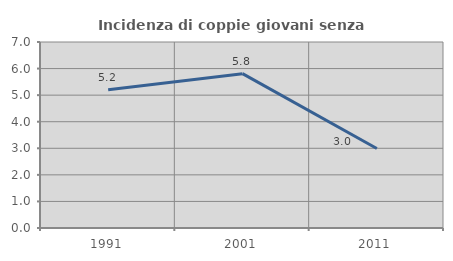
| Category | Incidenza di coppie giovani senza figli |
|---|---|
| 1991.0 | 5.204 |
| 2001.0 | 5.808 |
| 2011.0 | 2.994 |